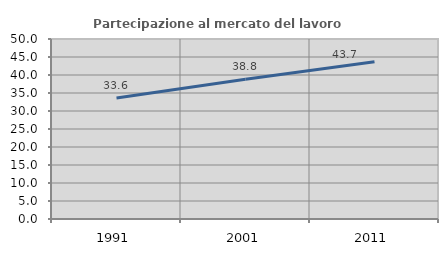
| Category | Partecipazione al mercato del lavoro  femminile |
|---|---|
| 1991.0 | 33.586 |
| 2001.0 | 38.796 |
| 2011.0 | 43.697 |